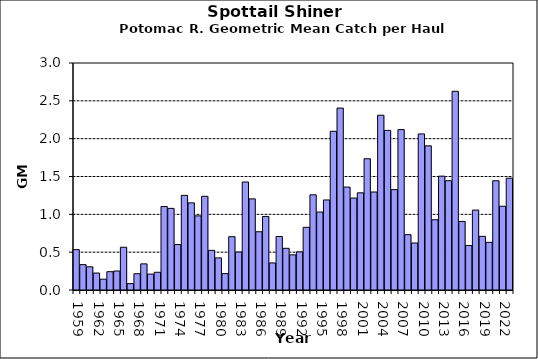
| Category | Series 0 |
|---|---|
| 1959.0 | 0.534 |
| 1960.0 | 0.335 |
| 1961.0 | 0.306 |
| 1962.0 | 0.224 |
| 1963.0 | 0.143 |
| 1964.0 | 0.242 |
| 1965.0 | 0.251 |
| 1966.0 | 0.565 |
| 1967.0 | 0.084 |
| 1968.0 | 0.215 |
| 1969.0 | 0.345 |
| 1970.0 | 0.21 |
| 1971.0 | 0.234 |
| 1972.0 | 1.103 |
| 1973.0 | 1.079 |
| 1974.0 | 0.601 |
| 1975.0 | 1.25 |
| 1976.0 | 1.151 |
| 1977.0 | 0.98 |
| 1978.0 | 1.238 |
| 1979.0 | 0.524 |
| 1980.0 | 0.424 |
| 1981.0 | 0.216 |
| 1982.0 | 0.704 |
| 1983.0 | 0.502 |
| 1984.0 | 1.427 |
| 1985.0 | 1.204 |
| 1986.0 | 0.77 |
| 1987.0 | 0.972 |
| 1988.0 | 0.357 |
| 1989.0 | 0.707 |
| 1990.0 | 0.551 |
| 1991.0 | 0.465 |
| 1992.0 | 0.504 |
| 1993.0 | 0.829 |
| 1994.0 | 1.258 |
| 1995.0 | 1.03 |
| 1996.0 | 1.19 |
| 1997.0 | 2.098 |
| 1998.0 | 2.404 |
| 1999.0 | 1.36 |
| 2000.0 | 1.215 |
| 2001.0 | 1.284 |
| 2002.0 | 1.735 |
| 2003.0 | 1.295 |
| 2004.0 | 2.31 |
| 2005.0 | 2.109 |
| 2006.0 | 1.326 |
| 2007.0 | 2.12 |
| 2008.0 | 0.731 |
| 2009.0 | 0.621 |
| 2010.0 | 2.063 |
| 2011.0 | 1.905 |
| 2012.0 | 0.928 |
| 2013.0 | 1.505 |
| 2014.0 | 1.444 |
| 2015.0 | 2.626 |
| 2016.0 | 0.906 |
| 2017.0 | 0.588 |
| 2018.0 | 1.056 |
| 2019.0 | 0.709 |
| 2020.0 | 0.63 |
| 2021.0 | 1.444 |
| 2022.0 | 1.107 |
| 2023.0 | 1.478 |